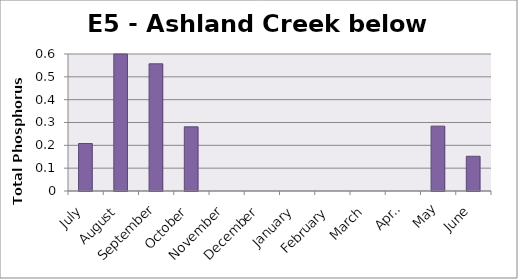
| Category | Phosphorus (mg/L) |
|---|---|
| July | 0.208 |
| August | 0.708 |
| September | 0.557 |
| October | 0.281 |
| November | 0 |
| December | 0 |
| January | 0 |
| February | 0 |
| March | 0 |
| April | 0 |
| May | 0.284 |
| June | 0.152 |